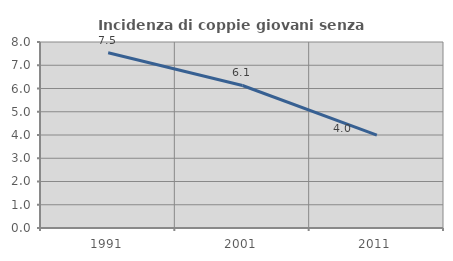
| Category | Incidenza di coppie giovani senza figli |
|---|---|
| 1991.0 | 7.534 |
| 2001.0 | 6.13 |
| 2011.0 | 3.997 |